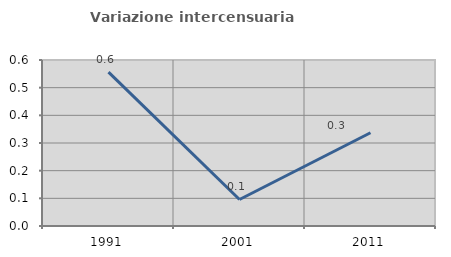
| Category | Variazione intercensuaria annua |
|---|---|
| 1991.0 | 0.556 |
| 2001.0 | 0.096 |
| 2011.0 | 0.337 |